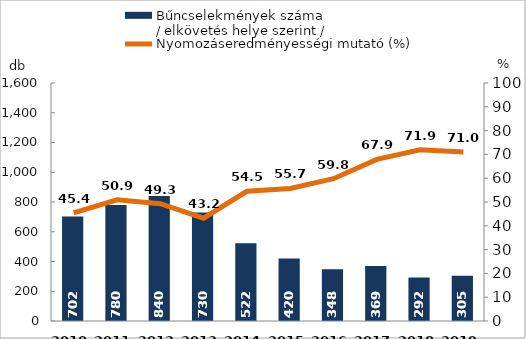
| Category | Bűncselekmények száma
/ elkövetés helye szerint / |
|---|---|
| 2010. év | 702 |
| 2011. év | 780 |
| 2012. év | 840 |
| 2013. év | 730 |
| 2014. év | 522 |
| 2015. év | 420 |
| 2016. év | 348 |
| 2017. év | 369 |
| 2018. év | 292 |
| 2019. év | 305 |